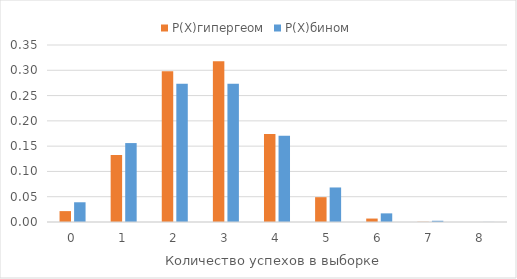
| Category | Р(Х)гипергеом | Р(Х)бином |
|---|---|---|
| 0.0 | 0.022 | 0.039 |
| 1.0 | 0.132 | 0.156 |
| 2.0 | 0.298 | 0.273 |
| 3.0 | 0.318 | 0.273 |
| 4.0 | 0.174 | 0.171 |
| 5.0 | 0.049 | 0.068 |
| 6.0 | 0.007 | 0.017 |
| 7.0 | 0 | 0.002 |
| 8.0 | 0 | 0 |